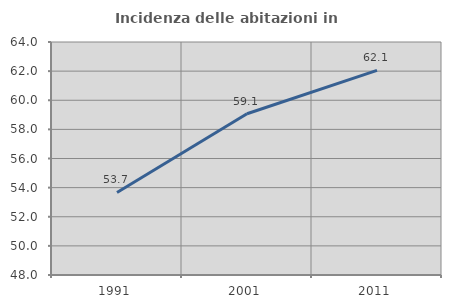
| Category | Incidenza delle abitazioni in proprietà  |
|---|---|
| 1991.0 | 53.67 |
| 2001.0 | 59.07 |
| 2011.0 | 62.054 |